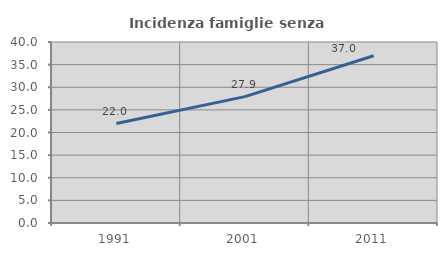
| Category | Incidenza famiglie senza nuclei |
|---|---|
| 1991.0 | 21.982 |
| 2001.0 | 27.928 |
| 2011.0 | 36.967 |